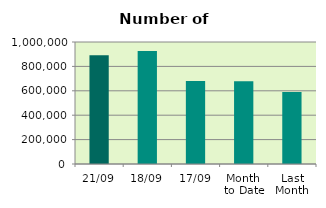
| Category | Series 0 |
|---|---|
| 21/09 | 890628 |
| 18/09 | 926644 |
| 17/09 | 679866 |
| Month 
to Date | 678452.4 |
| Last
Month | 590023.333 |